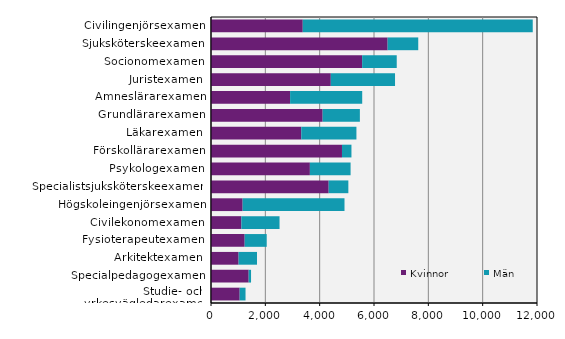
| Category | Kvinnor | Män |
|---|---|---|
| Studie- och yrkesvägledarexamen | 1056 | 215 |
| Specialpedagogexamen | 1387 | 87 |
| Arkitektexamen | 1016 | 678 |
| Fysioterapeutexamen | 1240 | 811 |
| Civilekonomexamen | 1118 | 1405 |
| Högskoleingenjörsexamen | 1165 | 3749 |
| Specialistsjuksköterskeexamen | 4332 | 724 |
| Psykologexamen | 3640 | 1498 |
| Förskollärarexamen | 4821 | 349 |
| Läkarexamen | 3323 | 2030 |
| Grundlärarexamen | 4110 | 1370 |
| Ämneslärarexamen | 2912 | 2654 |
| Juristexamen | 4410 | 2364 |
| Socionomexamen | 5564 | 1273 |
| Sjuksköterskeexamen | 6502 | 1127 |
| Civilingenjörsexamen | 3378 | 8465 |